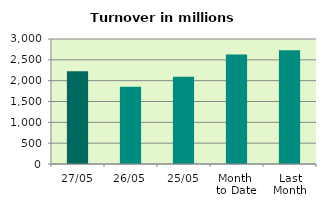
| Category | Series 0 |
|---|---|
| 27/05 | 2228.772 |
| 26/05 | 1851.872 |
| 25/05 | 2096.161 |
| Month 
to Date | 2626.029 |
| Last
Month | 2727.753 |